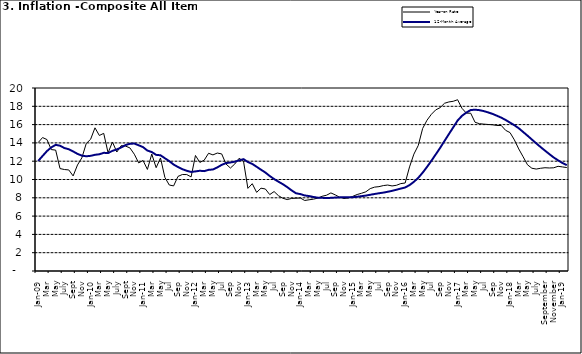
| Category | Year-on Rate | 12-Month Average |
|---|---|---|
| Jan-09 | 14.034 | 12.032 |
| Feb | 14.584 | 12.567 |
| Mar | 14.366 | 13.101 |
| Apr | 13.268 | 13.51 |
| May | 13.212 | 13.787 |
| June | 11.194 | 13.694 |
| July | 11.09 | 13.437 |
| Aug | 11.046 | 13.307 |
| Sept | 10.39 | 13.065 |
| Oct | 11.588 | 12.803 |
| Nov | 12.368 | 12.609 |
| Dec | 13.93 | 12.538 |
| Jan-10 | 14.398 | 12.586 |
| Feb | 15.649 | 12.7 |
| Mar | 14.812 | 12.757 |
| Apr | 15.044 | 12.915 |
| May | 12.915 | 12.893 |
| June | 14.099 | 13.132 |
| July | 13.002 | 13.284 |
| Aug | 13.702 | 13.5 |
| Sept | 13.65 | 13.764 |
| Oct | 13.45 | 13.908 |
| Nov | 12.766 | 13.928 |
| Dec | 11.815 | 13.74 |
| Jan-11 | 12.08 | 13.542 |
| Feb | 11.1 | 13.161 |
| Mar | 12.779 | 13.001 |
| Apr | 11.291 | 12.694 |
| May | 12.352 | 12.648 |
| Jun | 10.23 | 12.321 |
| Jul | 9.397 | 12.009 |
| Aug | 9.301 | 11.635 |
| Sep | 10.339 | 11.363 |
| Oct | 10.544 | 11.13 |
| Nov | 10.54 | 10.952 |
| Dec | 10.283 | 10.826 |
| Jan-12 | 12.626 | 10.886 |
| Feb | 11.866 | 10.955 |
| Mar | 12.111 | 10.914 |
| Apr | 12.866 | 11.054 |
| May | 12.688 | 11.096 |
| Jun | 12.892 | 11.32 |
| Jul | 12.797 | 11.599 |
| Aug | 11.689 | 11.791 |
| Sep | 11.253 | 11.859 |
| Oct | 11.693 | 11.948 |
| Nov | 12.32 | 12.091 |
| Dec | 11.981 | 12.224 |
| Jan-13 | 9.031 | 11.908 |
| Feb | 9.542 | 11.703 |
| Mar | 8.593 | 11.394 |
| Apr | 9.052 | 11.072 |
| May | 8.964 | 10.761 |
| Jun | 8.353 | 10.383 |
| Jul | 8.682 | 10.047 |
| Aug | 8.231 | 9.761 |
| Sep | 7.952 | 9.486 |
| Oct | 7.807 | 9.167 |
| Nov | 7.931 | 8.815 |
| Dec | 7.957 | 8.496 |
| Jan-14 | 7.977 | 8.408 |
| Feb | 7.707 | 8.257 |
| Mar | 7.783 | 8.19 |
| Apr | 7.851 | 8.092 |
| May | 7.965 | 8.012 |
| Jun | 8.167 | 7.998 |
| Jul | 8.281 | 7.968 |
| Aug | 8.534 | 7.996 |
| Sep | 8.317 | 8.027 |
| Oct | 8.06 | 8.047 |
| Nov | 7.927 | 8.046 |
| Dec | 7.978 | 8.047 |
| Jan-15 | 8.157 | 8.063 |
| Feb | 8.359 | 8.117 |
| Mar | 8.494 | 8.176 |
| Apr | 8.655 | 8.243 |
| May | 9.003 | 8.331 |
| Jun | 9.168 | 8.417 |
| Jul | 9.218 | 8.497 |
| Aug | 9.336 | 8.566 |
| Sep | 9.394 | 8.658 |
| Oct | 9.296 | 8.76 |
| Nov | 9.368 | 8.879 |
| Dec | 9.554 | 9.009 |
| Jan-16 | 9.617 | 9.13 |
| Feb | 11.379 | 9.386 |
| Mar | 12.775 | 9.751 |
| Apr | 13.721 | 10.182 |
| May | 15.577 | 10.746 |
| Jun | 16.48 | 11.372 |
| Jul | 17.127 | 12.045 |
| Aug | 17.609 | 12.744 |
| Sep | 17.852 | 13.454 |
| Oct | 18.33 | 14.206 |
| Nov | 18.476 | 14.958 |
| Dec | 18.547 | 15.697 |
| Jan-17 | 18.719 | 16.441 |
| Feb | 17.78 | 16.958 |
| Mar | 17.256 | 17.315 |
| Apr | 17.244 | 17.591 |
| May | 16.251 | 17.628 |
| Jun | 16.098 | 17.578 |
| Jul | 16.053 | 17.475 |
| Aug | 16.012 | 17.331 |
| Sep | 15.979 | 17.17 |
| Oct | 15.905 | 16.968 |
| Nov | 15.901 | 16.76 |
| Dec | 15.372 | 16.502 |
| Jan-18 | 15.127 | 16.215 |
| Feb | 14.33 | 15.93 |
| Mar | 13.337 | 15.599 |
| Apr | 12.482 | 15.196 |
| May | 11.608 | 14.793 |
| June | 11.231 | 14.371 |
| July | 11.142 | 13.95 |
| August | 11.227 | 13.546 |
| September | 11.284 | 13.157 |
| October | 11.259 | 12.777 |
| November | 11.281 | 12.406 |
| December | 11.442 | 12.095 |
| Jan-19 | 11.374 | 11.801 |
| February | 11.306 | 11.564 |